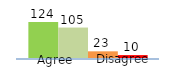
| Category | Series 0 | Series 1 | Series 2 | Series 3 |
|---|---|---|---|---|
| 0 | 124 | 105 | 23 | 10 |